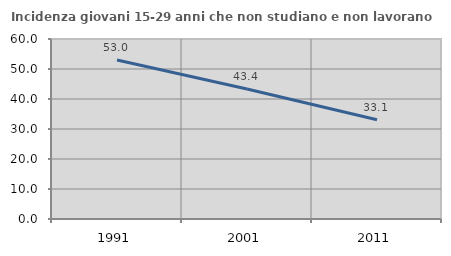
| Category | Incidenza giovani 15-29 anni che non studiano e non lavorano  |
|---|---|
| 1991.0 | 53.022 |
| 2001.0 | 43.354 |
| 2011.0 | 33.1 |